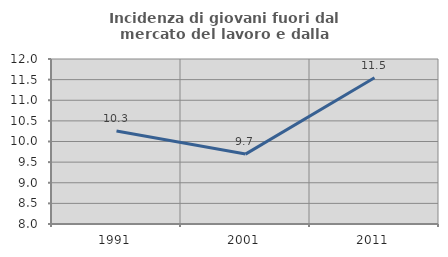
| Category | Incidenza di giovani fuori dal mercato del lavoro e dalla formazione  |
|---|---|
| 1991.0 | 10.256 |
| 2001.0 | 9.695 |
| 2011.0 | 11.546 |